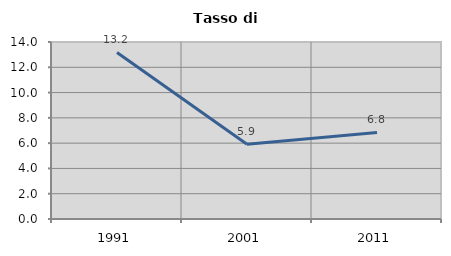
| Category | Tasso di disoccupazione   |
|---|---|
| 1991.0 | 13.171 |
| 2001.0 | 5.914 |
| 2011.0 | 6.842 |